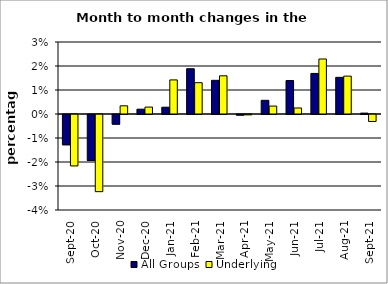
| Category | All Groups | Underlying |
|---|---|---|
| 2020-09-01 | -0.013 | -0.021 |
| 2020-10-01 | -0.019 | -0.032 |
| 2020-11-01 | -0.004 | 0.003 |
| 2020-12-01 | 0.002 | 0.003 |
| 2021-01-01 | 0.003 | 0.014 |
| 2021-02-01 | 0.019 | 0.013 |
| 2021-03-01 | 0.014 | 0.016 |
| 2021-04-01 | 0 | 0 |
| 2021-05-01 | 0.006 | 0.003 |
| 2021-06-01 | 0.014 | 0.003 |
| 2021-07-01 | 0.017 | 0.023 |
| 2021-08-01 | 0.015 | 0.016 |
| 2021-09-01 | 0 | -0.003 |